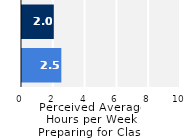
| Category | Series 0 |
|---|---|
| Upper Division | 2.473 |
| Lower Division | 2 |